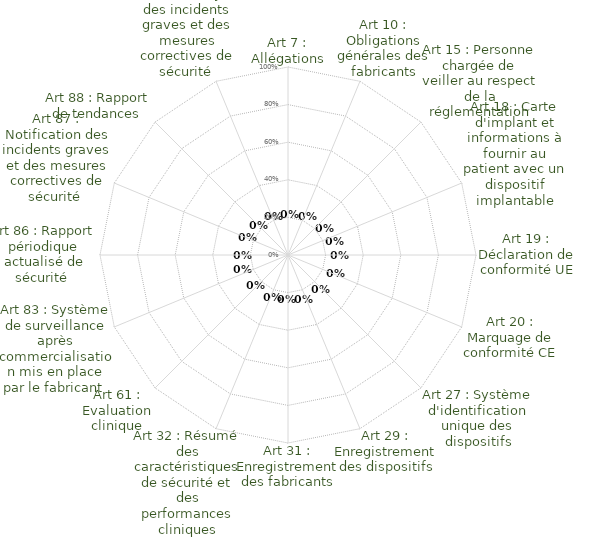
| Category | Articles des Chapitres |
|---|---|
| Art 7 : Allégations | 0 |
| Art 10 : Obligations générales des fabricants | 0 |
| Art 15 : Personne chargée de veiller au respect de la réglementation | 0 |
| Art 18 : Carte d'implant et informations à fournir au patient avec un dispositif implantable | 0 |
| Art 19 : Déclaration de conformité UE | 0 |
| Art 20 : Marquage de conformité CE | 0 |
| Art 27 : Système d'identification unique des dispositifs | 0 |
| Art 29 : Enregistrement des dispositifs | 0 |
| Art 31 : Enregistrement des fabricants | 0 |
| Art 32 : Résumé des caractéristiques de sécurité et des performances cliniques | 0 |
| Art 61 : Evaluation clinique | 0 |
| Art 83 : Système de surveillance après commercialisation mis en place par le fabricant  | 0 |
| Art 86 : Rapport périodique actualisé de sécurité  | 0 |
| Art 87 : Notification des incidents graves et des mesures correctives de sécurité  | 0 |
| Art 88 : Rapport de tendances  | 0 |
| Art 89 : Analyse des incidents graves et des mesures correctives de sécurité  | 0 |